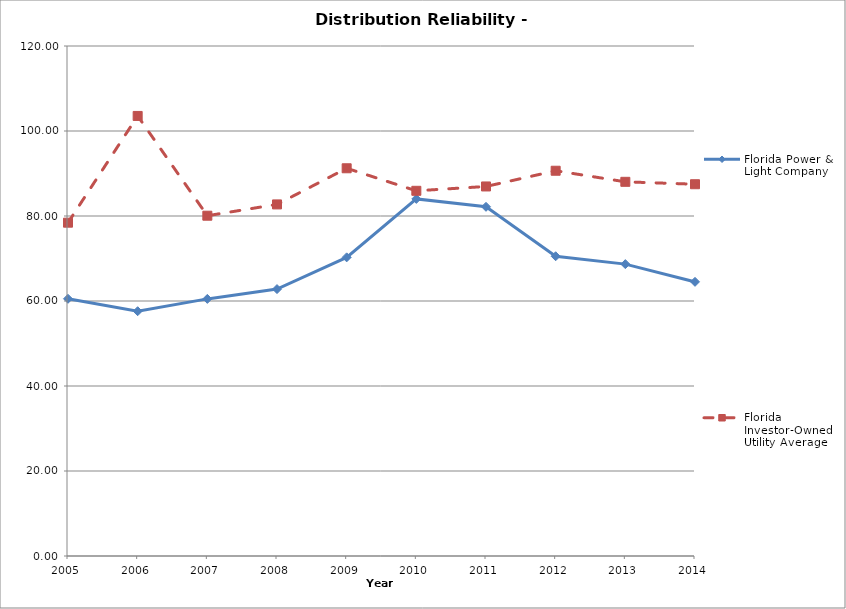
| Category | Florida Power & Light Company | Florida Investor-Owned Utility Average |
|---|---|---|
| 2005.0 | 60.522 | 78.427 |
| 2006.0 | 57.597 | 103.543 |
| 2007.0 | 60.496 | 80.068 |
| 2008.0 | 62.804 | 82.728 |
| 2009.0 | 70.27 | 91.229 |
| 2010.0 | 84.022 | 85.928 |
| 2011.0 | 82.165 | 86.949 |
| 2012.0 | 70.53 | 90.649 |
| 2013.0 | 68.678 | 88.041 |
| 2014.0 | 64.508 | 87.476 |